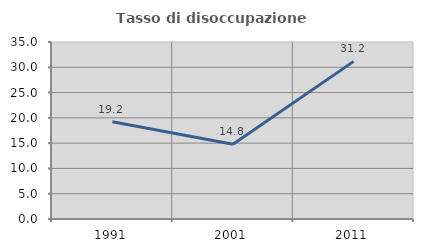
| Category | Tasso di disoccupazione giovanile  |
|---|---|
| 1991.0 | 19.236 |
| 2001.0 | 14.792 |
| 2011.0 | 31.169 |